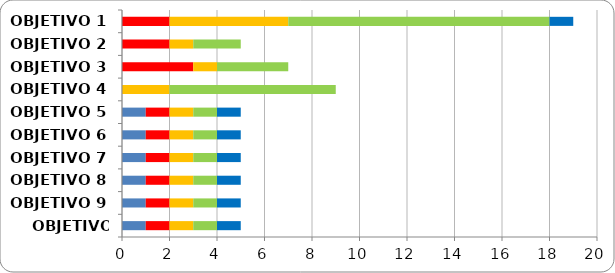
| Category | Series 0 | Series 1 | Series 2 | Series 3 | Series 4 |
|---|---|---|---|---|---|
| OBJETIVO 1 | 0 | 2 | 5 | 11 | 1 |
| OBJETIVO 2 | 0 | 2 | 1 | 2 | 0 |
| OBJETIVO 3 | 0 | 3 | 1 | 3 | 0 |
| OBJETIVO 4 | 0 | 0 | 2 | 7 | 0 |
| OBJETIVO 5 | 1 | 1 | 1 | 1 | 1 |
| OBJETIVO 6 | 1 | 1 | 1 | 1 | 1 |
| OBJETIVO 7 | 1 | 1 | 1 | 1 | 1 |
| OBJETIVO 8 | 1 | 1 | 1 | 1 | 1 |
| OBJETIVO 9 | 1 | 1 | 1 | 1 | 1 |
| OBJETIVO 10 | 1 | 1 | 1 | 1 | 1 |